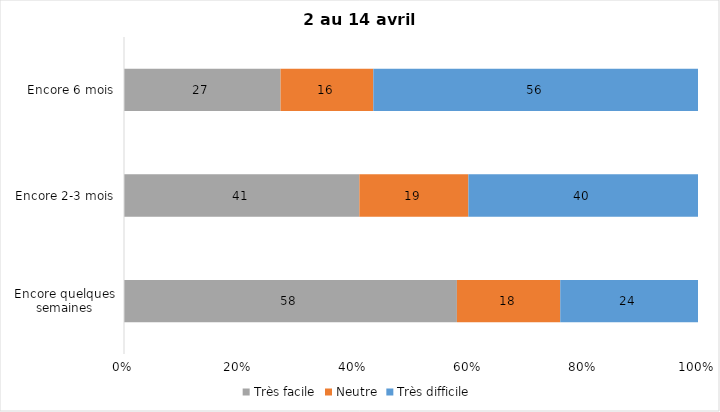
| Category | Très facile | Neutre | Très difficile |
|---|---|---|---|
| Encore quelques semaines | 58 | 18 | 24 |
| Encore 2-3 mois | 41 | 19 | 40 |
| Encore 6 mois | 27 | 16 | 56 |